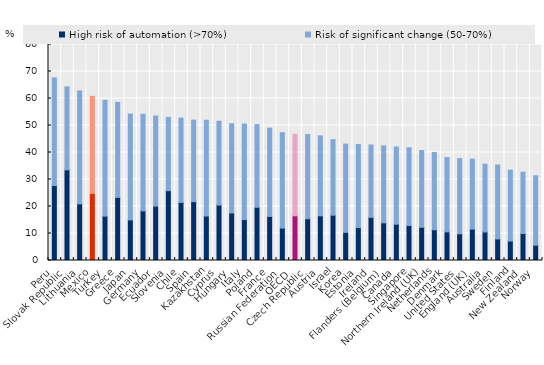
| Category | High risk of automation (>70%) | Risk of significant change (50-70%) |
|---|---|---|
| Peru | 27.76 | 39.87 |
| Slovak Republic | 33.56 | 30.75 |
| Lithuania | 20.98 | 41.82 |
| Mexico | 24.86 | 35.94 |
| Turkey | 16.42 | 42.91 |
| Greece | 23.36 | 35.23 |
| Japan | 15.03 | 39.2 |
| Germany | 18.37 | 35.79 |
| Ecuador | 20.12 | 33.38 |
| Slovenia | 25.87 | 27.13 |
| Chile | 21.5 | 31.23 |
| Spain | 21.8 | 30.19 |
| Kazakhstan | 16.47 | 35.48 |
| Cyprus | 20.52 | 31.05 |
| Hungary | 17.6 | 33.05 |
| Italy | 15.16 | 35.35 |
| Poland | 19.7 | 30.63 |
| France | 16.33 | 32.7 |
| Russian Federation | 12 | 35.35 |
| OECD  | 16.57 | 30.18 |
| Czech Republic | 15.46 | 31.17 |
| Austria | 16.55 | 29.62 |
| Israel | 16.77 | 28 |
| Korea | 10.42 | 32.71 |
| Estonia | 12.19 | 30.78 |
| Ireland | 15.97 | 26.82 |
| Flanders (Belgium) | 13.96 | 28.49 |
| Canada | 13.45 | 28.59 |
| Singapore | 12.97 | 28.8 |
| Northern Ireland (UK) | 12.3 | 28.45 |
| Netherlands | 11.37 | 28.64 |
| Denmark | 10.61 | 27.52 |
| United States | 9.9 | 27.85 |
| England (UK) | 11.64 | 25.9 |
| Australia | 10.57 | 25.11 |
| Sweden | 7.99 | 27.38 |
| Finland | 7.21 | 26.23 |
| New Zealand | 9.98 | 22.72 |
| Norway | 5.67 | 25.74 |